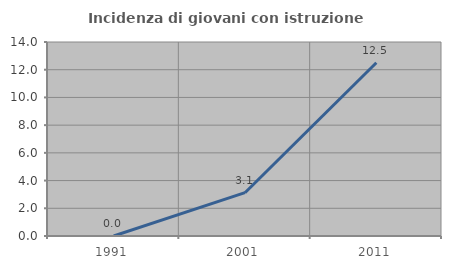
| Category | Incidenza di giovani con istruzione universitaria |
|---|---|
| 1991.0 | 0 |
| 2001.0 | 3.125 |
| 2011.0 | 12.5 |